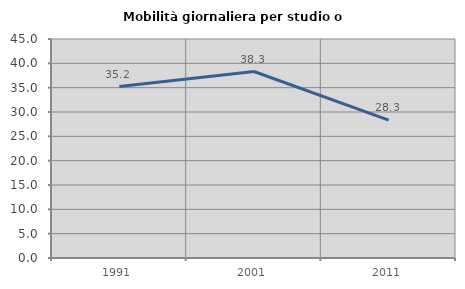
| Category | Mobilità giornaliera per studio o lavoro |
|---|---|
| 1991.0 | 35.222 |
| 2001.0 | 38.315 |
| 2011.0 | 28.344 |